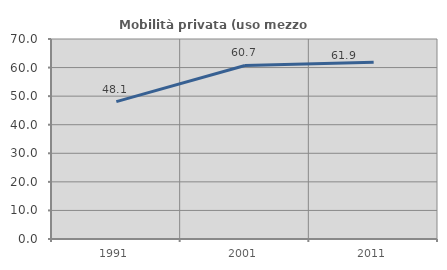
| Category | Mobilità privata (uso mezzo privato) |
|---|---|
| 1991.0 | 48.097 |
| 2001.0 | 60.742 |
| 2011.0 | 61.853 |